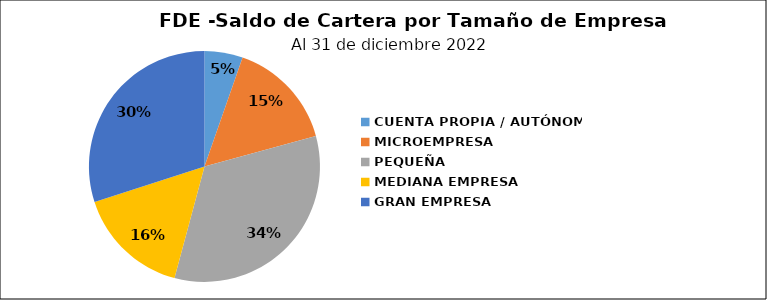
| Category | Saldo | Créditos |
|---|---|---|
| CUENTA PROPIA / AUTÓNOMA | 2.82 | 209 |
| MICROEMPRESA | 8.104 | 362 |
| PEQUEÑA | 17.631 | 169 |
| MEDIANA EMPRESA | 8.357 | 39 |
| GRAN EMPRESA | 15.786 | 33 |